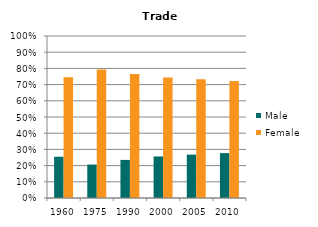
| Category | Male | Female |
|---|---|---|
| 1960.0 | 0.255 | 0.745 |
| 1975.0 | 0.207 | 0.793 |
| 1990.0 | 0.235 | 0.765 |
| 2000.0 | 0.256 | 0.744 |
| 2005.0 | 0.268 | 0.732 |
| 2010.0 | 0.277 | 0.723 |